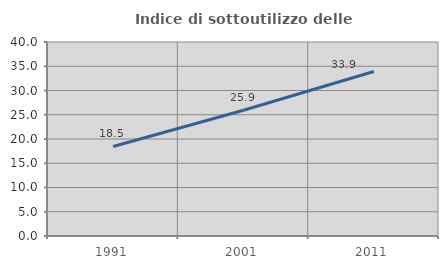
| Category | Indice di sottoutilizzo delle abitazioni  |
|---|---|
| 1991.0 | 18.466 |
| 2001.0 | 25.929 |
| 2011.0 | 33.914 |